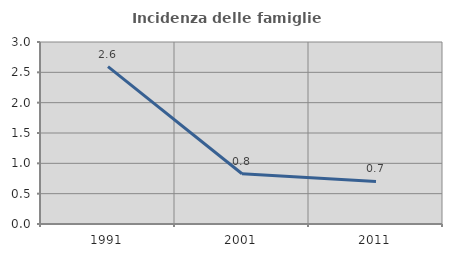
| Category | Incidenza delle famiglie numerose |
|---|---|
| 1991.0 | 2.595 |
| 2001.0 | 0.828 |
| 2011.0 | 0.702 |